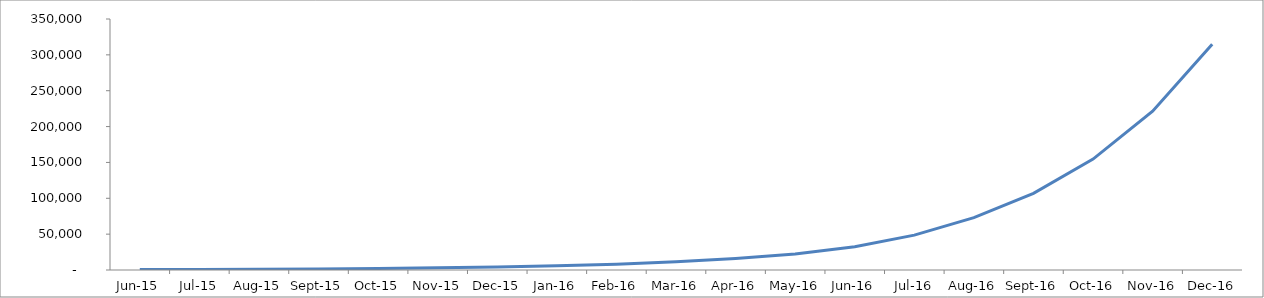
| Category | Series 0 |
|---|---|
| 2015-06-01 | 553 |
| 2015-07-01 | 774.2 |
| 2015-08-01 | 1083.88 |
| 2015-09-01 | 1517.432 |
| 2015-10-01 | 2124.405 |
| 2015-11-01 | 2974.167 |
| 2015-12-01 | 4163.833 |
| 2016-01-01 | 5829.367 |
| 2016-02-01 | 8161.113 |
| 2016-03-01 | 11425.559 |
| 2016-04-01 | 15995.782 |
| 2016-05-01 | 22394.095 |
| 2016-06-01 | 32566.734 |
| 2016-07-01 | 48630.927 |
| 2016-08-01 | 72943.298 |
| 2016-09-01 | 106980.617 |
| 2016-10-01 | 154632.864 |
| 2016-11-01 | 221346.009 |
| 2016-12-01 | 314744.413 |